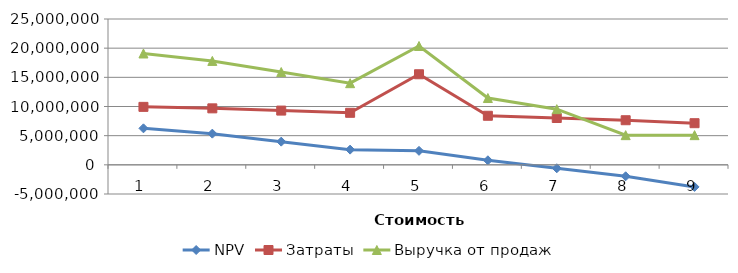
| Category | NPV | Затраты | Выручка от продаж |
|---|---|---|---|
| 0 | 6258935.139 | 9937000 | 19087500 |
| 1 | 5345684.938 | 9682500 | 17815000 |
| 2 | 3975809.635 | 9300750 | 15906250 |
| 3 | 2605934.332 | 8919000 | 13997500 |
| 4 | 2398448.013 | 15527785 | 20375000 |
| 5 | 779433.928 | 8410000 | 11452500 |
| 6 | -590441.374 | 8028250 | 9543750 |
| 7 | -1960316.677 | 7646500 | 5090000 |
| 8 | -3786817.081 | 7137500 | 5090000 |